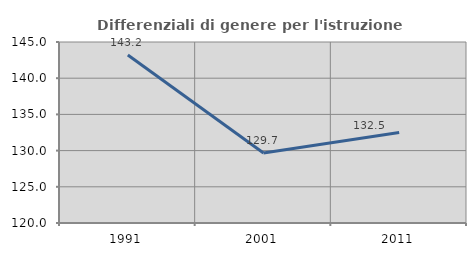
| Category | Differenziali di genere per l'istruzione superiore |
|---|---|
| 1991.0 | 143.202 |
| 2001.0 | 129.665 |
| 2011.0 | 132.49 |